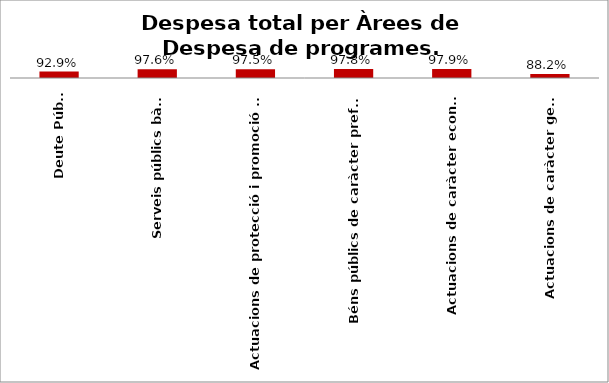
| Category | Series 0 |
|---|---|
| Deute Públic | 0.929 |
| Serveis públics bàsics | 0.976 |
| Actuacions de protecció i promoció social | 0.975 |
| Béns públics de caràcter preferent | 0.978 |
| Actuacions de caràcter econòmic | 0.979 |
| Actuacions de caràcter general | 0.882 |